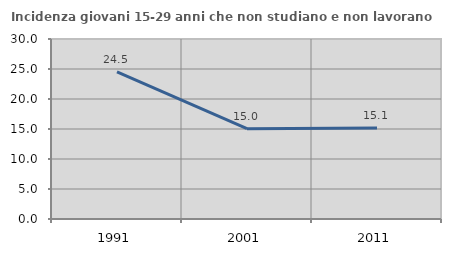
| Category | Incidenza giovani 15-29 anni che non studiano e non lavorano  |
|---|---|
| 1991.0 | 24.506 |
| 2001.0 | 15.043 |
| 2011.0 | 15.148 |